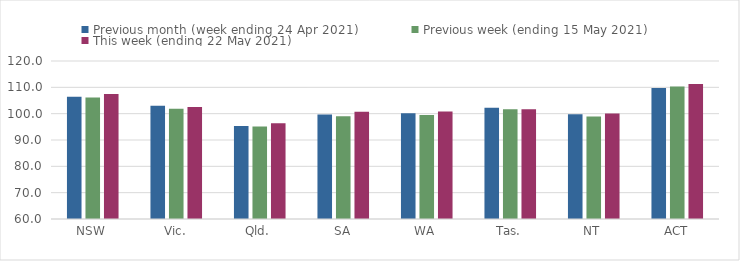
| Category | Previous month (week ending 24 Apr 2021) | Previous week (ending 15 May 2021) | This week (ending 22 May 2021) |
|---|---|---|---|
| NSW | 106.46 | 106.17 | 107.44 |
| Vic. | 103.03 | 101.85 | 102.57 |
| Qld. | 95.3 | 95.1 | 96.34 |
| SA | 99.64 | 98.99 | 100.72 |
| WA | 100.19 | 99.49 | 100.79 |
| Tas. | 102.26 | 101.65 | 101.65 |
| NT | 99.8 | 98.92 | 100.04 |
| ACT | 109.7 | 110.3 | 111.27 |